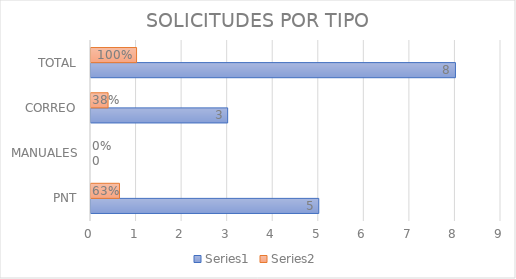
| Category | Series 0 | Series 1 |
|---|---|---|
| PNT | 5 | 0.625 |
| MANUALES | 0 | 0 |
| CORREO | 3 | 0.375 |
| TOTAL | 8 | 1 |